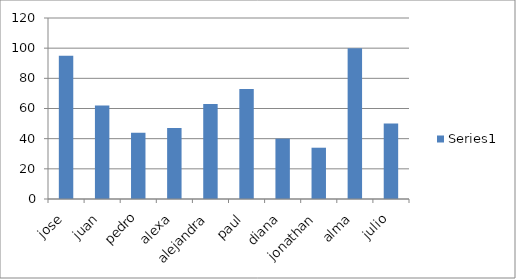
| Category | Series 0 |
|---|---|
| jose | 95 |
| juan | 62 |
| pedro | 44 |
| alexa | 47 |
| alejandra | 63 |
| paul | 73 |
| diana | 40 |
| jonathan | 34 |
| alma | 100 |
| julio | 50 |